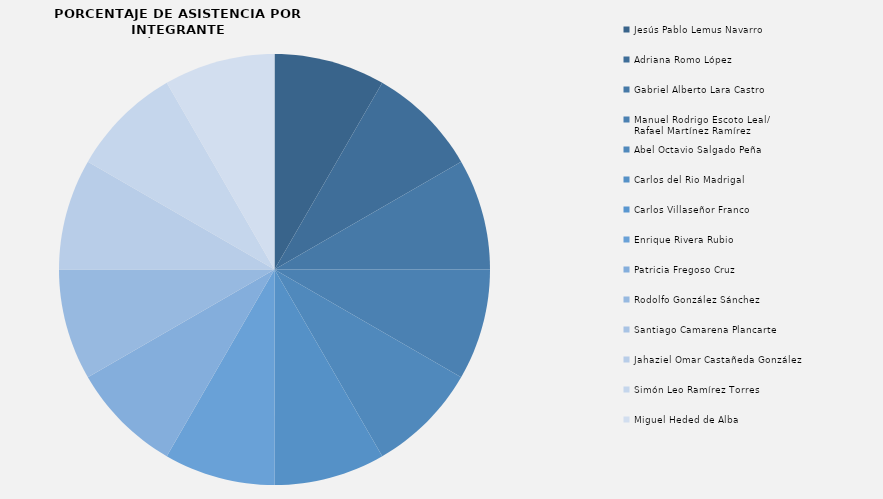
| Category | Series 0 |
|---|---|
| Jesús Pablo Lemus Navarro | 1 |
| Adriana Romo López | 1 |
| Gabriel Alberto Lara Castro  | 1 |
| Manuel Rodrigo Escoto Leal/
Rafael Martínez Ramírez   | 1 |
| Abel Octavio Salgado Peña  | 1 |
| Carlos del Rio Madrigal  | 1 |
| Carlos Villaseñor Franco  | 0 |
| Enrique Rivera Rubio | 1 |
| Patricia Fregoso Cruz | 1 |
| Rodolfo González Sánchez | 1 |
| Santiago Camarena Plancarte | 0 |
| Jahaziel Omar Castañeda González  | 1 |
| Simón Leo Ramírez Torres | 1 |
| Miguel Heded de Alba | 1 |